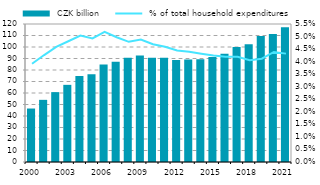
| Category |  CZK billion |
|---|---|
| 2000.0 | 46.501 |
| 2001.0 | 54.043 |
| 2002.0 | 60.759 |
| 2003.0 | 67.091 |
| 2004.0 | 74.718 |
| 2005.0 | 76.372 |
| 2006.0 | 84.814 |
| 2007.0 | 87.219 |
| 2008.0 | 90.562 |
| 2009.0 | 92.643 |
| 2010.0 | 90.738 |
| 2011.0 | 90.74 |
| 2012.0 | 88.698 |
| 2013.0 | 89.123 |
| 2014.0 | 89.45 |
| 2015.0 | 91.39 |
| 2016.0 | 94.027 |
| 2017.0 | 99.995 |
| 2018.0 | 102.382 |
| 2019.0 | 109.608 |
| 2020.0 | 111.201 |
| 2021.0 | 117.268 |